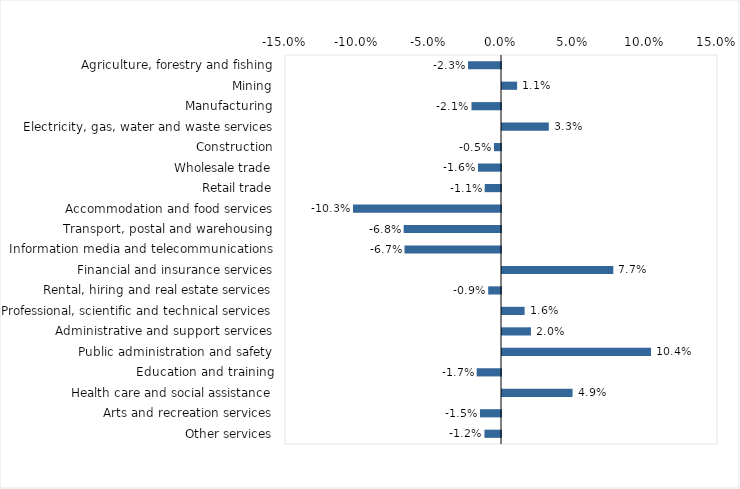
| Category | This week |
|---|---|
| Agriculture, forestry and fishing | -0.023 |
| Mining | 0.01 |
| Manufacturing | -0.02 |
| Electricity, gas, water and waste services | 0.032 |
| Construction | -0.005 |
| Wholesale trade | -0.016 |
| Retail trade | -0.011 |
| Accommodation and food services | -0.103 |
| Transport, postal and warehousing | -0.068 |
| Information media and telecommunications | -0.067 |
| Financial and insurance services | 0.077 |
| Rental, hiring and real estate services | -0.009 |
| Professional, scientific and technical services | 0.016 |
| Administrative and support services | 0.02 |
| Public administration and safety | 0.104 |
| Education and training | -0.017 |
| Health care and social assistance | 0.049 |
| Arts and recreation services | -0.015 |
| Other services | -0.012 |